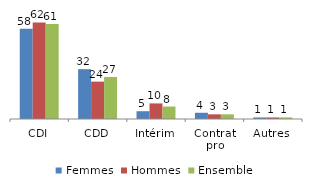
| Category | Femmes | Hommes | Ensemble |
|---|---|---|---|
| CDI | 58 | 62 | 61 |
| CDD | 32 | 24 | 27 |
| Intérim | 5 | 10 | 8 |
| Contrat pro | 4 | 3 | 3 |
| Autres | 1 | 1 | 1 |